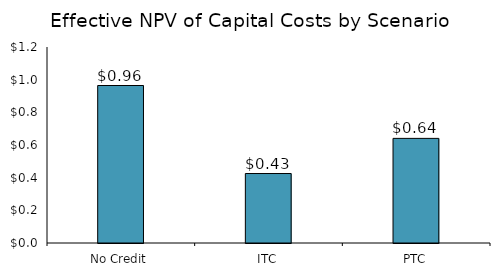
| Category | NPV |
|---|---|
| No Credit | 964270.863 |
| ITC | 425341.819 |
| PTC | 640558.281 |